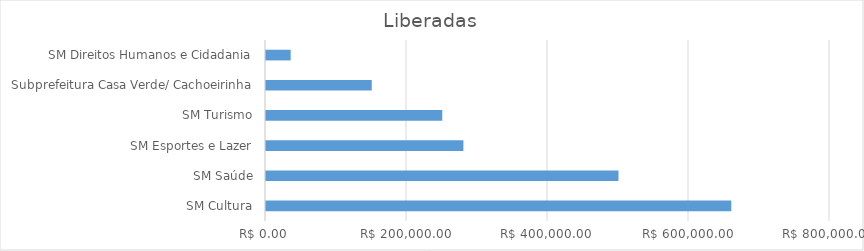
| Category | Series 0 |
|---|---|
| SM Cultura | 660000 |
| SM Saúde | 500000 |
| SM Esportes e Lazer | 280000 |
| SM Turismo | 250000 |
| Subprefeitura Casa Verde/ Cachoeirinha | 150000 |
| SM Direitos Humanos e Cidadania | 35000 |